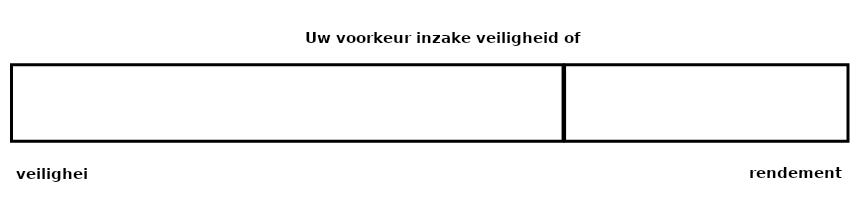
| Category | voorkeur klant | Series 0 |
|---|---|---|
| 0 | 165 | 85 |